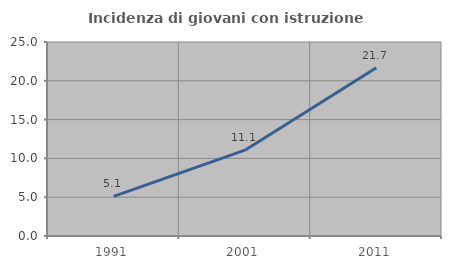
| Category | Incidenza di giovani con istruzione universitaria |
|---|---|
| 1991.0 | 5.112 |
| 2001.0 | 11.06 |
| 2011.0 | 21.694 |